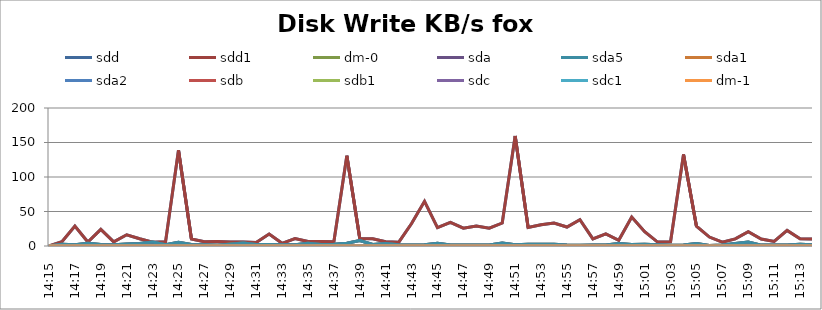
| Category | sdd | sdd1 | dm-0 | sda | sda5 | sda1 | sda2 | sdb | sdb1 | sdc | sdc1 | dm-1 |
|---|---|---|---|---|---|---|---|---|---|---|---|---|
| 14:15 | 0 | 0 | 0 | 0 | 0 | 0 | 0 | 0 | 0 | 0 | 0 | 0 |
| 14:16 | 6.1 | 6.1 | 2.6 | 2.6 | 2.6 | 0 | 0 | 0 | 0 | 0 | 0 | 0 |
| 14:17 | 28.9 | 28.9 | 1.9 | 1.9 | 1.9 | 0 | 0 | 0 | 0 | 0 | 0 | 0 |
| 14:18 | 5.8 | 5.8 | 3.8 | 3.8 | 3.8 | 0 | 0 | 0 | 0 | 0 | 0 | 0 |
| 14:19 | 24.1 | 24.1 | 2.1 | 2.1 | 2.1 | 0 | 0 | 0 | 0 | 0 | 0 | 0 |
| 14:20 | 5.9 | 5.9 | 1.7 | 1.7 | 1.7 | 0 | 0 | 0 | 0 | 0 | 0 | 0 |
| 14:21 | 16.3 | 16.3 | 2.9 | 2.9 | 2.9 | 0 | 0 | 0 | 0 | 0 | 0 | 0 |
| 14:22 | 10.5 | 10.5 | 3.5 | 3.5 | 3.5 | 0 | 0 | 0 | 0 | 0 | 0 | 0 |
| 14:23 | 5.5 | 5.5 | 5.7 | 5.7 | 5.7 | 0 | 0 | 0 | 0 | 0 | 0 | 0 |
| 14:24 | 6 | 6 | 1.7 | 1.7 | 1.7 | 0 | 0 | 0 | 0 | 0 | 0 | 0 |
| 14:25 | 138.9 | 138.9 | 5.3 | 5.3 | 5.3 | 0 | 0 | 0 | 0 | 0 | 0 | 0 |
| 14:26 | 10.1 | 10.1 | 2.3 | 2.3 | 2.3 | 0 | 0 | 0 | 0 | 0 | 0 | 0 |
| 14:27 | 6.3 | 6.3 | 1.7 | 1.7 | 1.7 | 0 | 0 | 0 | 0 | 0 | 0 | 0 |
| 14:28 | 6.5 | 6.5 | 1.1 | 1.1 | 1.1 | 0 | 0 | 0 | 0 | 0 | 0 | 0 |
| 14:29 | 5.9 | 5.9 | 2.8 | 2.7 | 2.7 | 0 | 0 | 0 | 0 | 0 | 0 | 0 |
| 14:30 | 5.9 | 5.9 | 4.5 | 4.5 | 4.5 | 0 | 0 | 0 | 0 | 0 | 0 | 0 |
| 14:31 | 5.2 | 5.2 | 2.3 | 2.3 | 2.3 | 0 | 0 | 0 | 0 | 0 | 0 | 0 |
| 14:32 | 17.3 | 17.3 | 2.3 | 2.3 | 2.3 | 0 | 0 | 0 | 0 | 0 | 0 | 0 |
| 14:33 | 3.9 | 3.9 | 1.7 | 1.7 | 1.7 | 0 | 0 | 0 | 0 | 0 | 0 | 0 |
| 14:34 | 10.9 | 10.9 | 1.7 | 1.7 | 1.7 | 0 | 0 | 0 | 0 | 0 | 0 | 0 |
| 14:35 | 6.5 | 6.5 | 3.9 | 3.9 | 3.9 | 0 | 0 | 0 | 0 | 0 | 0 | 0 |
| 14:36 | 6.4 | 6.4 | 2.1 | 2.1 | 2.1 | 0 | 0 | 0 | 0 | 0 | 0 | 0 |
| 14:37 | 6.2 | 6.2 | 2.4 | 2.4 | 2.4 | 0 | 0 | 0 | 0 | 0 | 0 | 0 |
| 14:38 | 130.8 | 130.8 | 3.9 | 3.9 | 3.9 | 0 | 0 | 0 | 0 | 0 | 0 | 0 |
| 14:39 | 11 | 11 | 8 | 8 | 8 | 0 | 0 | 0 | 0 | 0 | 0 | 0 |
| 14:40 | 10.5 | 10.5 | 2.1 | 2.1 | 2.1 | 0 | 0 | 0 | 0 | 0 | 0 | 0 |
| 14:41 | 6.1 | 6.1 | 3.5 | 3.5 | 3.5 | 0 | 0 | 0 | 0 | 0 | 0 | 0 |
| 14:42 | 5.3 | 5.3 | 1.7 | 1.7 | 1.7 | 0 | 0 | 0 | 0 | 0 | 0 | 0 |
| 14:43 | 32.6 | 32.6 | 1.4 | 1.4 | 1.4 | 0 | 0 | 0 | 0 | 0 | 0 | 0 |
| 14:44 | 64.7 | 64.7 | 1.9 | 1.9 | 1.9 | 0 | 0 | 0 | 0 | 0 | 0 | 0 |
| 14:45 | 26.7 | 26.7 | 4.1 | 4.1 | 4.1 | 0 | 0 | 0 | 0 | 0 | 0 | 0 |
| 14:46 | 34.3 | 34.3 | 1.3 | 1.3 | 1.3 | 0 | 0 | 0 | 0 | 0 | 0 | 0 |
| 14:47 | 25.8 | 25.8 | 1.6 | 1.6 | 1.6 | 0 | 0 | 0 | 0 | 0 | 0 | 0 |
| 14:48 | 29.1 | 29.1 | 1.3 | 1.3 | 1.3 | 0 | 0 | 0 | 0 | 0 | 0 | 0 |
| 14:49 | 25.9 | 25.9 | 1.3 | 1.3 | 1.3 | 0 | 0 | 0 | 0 | 0 | 0 | 0 |
| 14:50 | 33.3 | 33.3 | 4.5 | 4.5 | 4.5 | 0 | 0 | 0 | 0 | 0 | 0 | 0 |
| 14:51 | 159.5 | 159.5 | 1.7 | 1.7 | 1.7 | 0 | 0 | 0 | 0 | 0 | 0 | 0 |
| 14:52 | 26.9 | 26.9 | 2.7 | 2.7 | 2.7 | 0 | 0 | 0 | 0 | 0 | 0 | 0 |
| 14:53 | 30.9 | 30.9 | 2.7 | 2.7 | 2.7 | 0 | 0 | 0 | 0 | 0 | 0 | 0 |
| 14:54 | 33.3 | 33.3 | 2.4 | 2.4 | 2.4 | 0 | 0 | 0 | 0 | 0 | 0 | 0 |
| 14:55 | 27.5 | 27.5 | 1.5 | 1.5 | 1.5 | 0 | 0 | 0 | 0 | 0 | 0 | 0 |
| 14:56 | 38 | 38 | 1.1 | 1.1 | 1.1 | 0 | 0 | 0 | 0 | 0 | 0 | 0 |
| 14:57 | 10.4 | 10.4 | 1.6 | 1.6 | 1.6 | 0 | 0 | 0 | 0 | 0 | 0 | 0 |
| 14:58 | 17.6 | 17.6 | 1.3 | 1.3 | 1.3 | 0 | 0 | 0 | 0 | 0 | 0 | 0 |
| 14:59 | 8.3 | 8.3 | 3.7 | 3.6 | 3.6 | 0 | 0 | 0 | 0 | 0 | 0 | 0 |
| 15:00 | 42 | 42 | 2.1 | 2.1 | 2.1 | 0 | 0 | 0 | 0 | 0 | 0 | 0 |
| 15:01 | 20.8 | 20.8 | 2.4 | 2.5 | 2.5 | 0 | 0 | 0 | 0 | 0 | 0 | 0 |
| 15:02 | 5.7 | 5.7 | 1.8 | 1.8 | 1.8 | 0 | 0 | 0 | 0 | 0 | 0 | 0 |
| 15:03 | 6.1 | 6.1 | 1.2 | 1.2 | 1.2 | 0 | 0 | 0 | 0 | 0 | 0 | 0 |
| 15:04 | 132.6 | 132.6 | 1.5 | 1.5 | 1.5 | 0 | 0 | 0 | 0 | 0 | 0 | 0 |
| 15:05 | 28.7 | 28.7 | 3.7 | 3.7 | 3.7 | 0 | 0 | 0 | 0 | 0 | 0 | 0 |
| 15:06 | 13 | 13 | 0.9 | 0.9 | 0.9 | 0 | 0 | 0 | 0 | 0 | 0 | 0 |
| 15:07 | 5.6 | 5.6 | 1.5 | 1.5 | 1.5 | 0 | 0 | 0 | 0 | 0 | 0 | 0 |
| 15:08 | 10.3 | 10.3 | 3.7 | 3.7 | 3.7 | 0 | 0 | 0 | 0 | 0 | 0 | 0 |
| 15:09 | 20.7 | 20.7 | 5.9 | 5.8 | 5.8 | 0 | 0 | 0 | 0 | 0 | 0 | 0 |
| 15:10 | 10.2 | 10.2 | 1.3 | 1.3 | 1.3 | 0 | 0 | 0 | 0 | 0 | 0 | 0 |
| 15:11 | 6.7 | 6.7 | 1.3 | 1.3 | 1.3 | 0 | 0 | 0 | 0 | 0 | 0 | 0 |
| 15:12 | 22.5 | 22.5 | 1.5 | 1.5 | 1.5 | 0 | 0 | 0 | 0 | 0 | 0 | 0 |
| 15:13 | 10.5 | 10.5 | 2.7 | 2.7 | 2.7 | 0 | 0 | 0 | 0 | 0 | 0 | 0 |
| 15:14 | 10.2 | 10.2 | 1.9 | 1.9 | 1.9 | 0 | 0 | 0 | 0 | 0 | 0 | 0 |